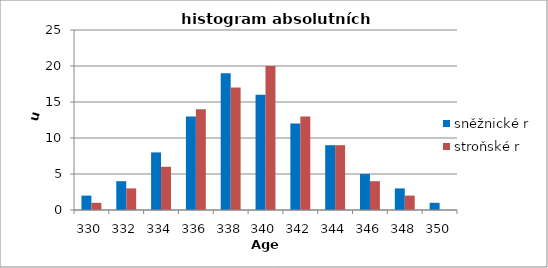
| Category | sněžnické r | stroňské r |
|---|---|---|
| 330.0 | 2 | 1 |
| 332.0 | 4 | 3 |
| 334.0 | 8 | 6 |
| 336.0 | 13 | 14 |
| 338.0 | 19 | 17 |
| 340.0 | 16 | 20 |
| 342.0 | 12 | 13 |
| 344.0 | 9 | 9 |
| 346.0 | 5 | 4 |
| 348.0 | 3 | 2 |
| 350.0 | 1 | 0 |